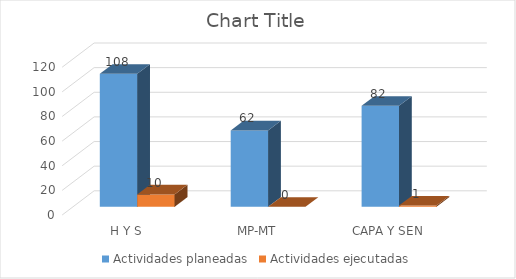
| Category | Actividades planeadas | Actividades ejecutadas |
|---|---|---|
| H Y S | 108 | 10 |
| MP-MT | 62 | 0 |
| CAPA Y SEN | 82 | 1 |